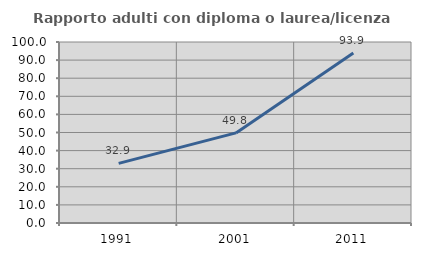
| Category | Rapporto adulti con diploma o laurea/licenza media  |
|---|---|
| 1991.0 | 32.922 |
| 2001.0 | 49.775 |
| 2011.0 | 93.916 |